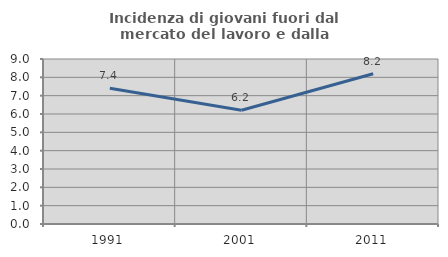
| Category | Incidenza di giovani fuori dal mercato del lavoro e dalla formazione  |
|---|---|
| 1991.0 | 7.407 |
| 2001.0 | 6.203 |
| 2011.0 | 8.197 |